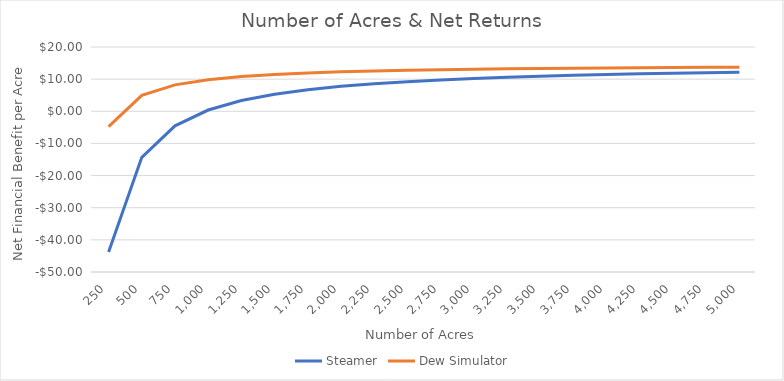
| Category | Steamer | Dew Simulator |
|---|---|---|
| 250.0 | -43.779 | -4.768 |
| 500.0 | -14.332 | 4.971 |
| 750.0 | -4.517 | 8.218 |
| 1000.0 | 0.391 | 9.841 |
| 1250.0 | 3.336 | 10.815 |
| 1500.0 | 5.299 | 11.464 |
| 1750.0 | 6.701 | 11.928 |
| 2000.0 | 7.753 | 12.276 |
| 2250.0 | 8.571 | 12.546 |
| 2500.0 | 9.225 | 12.763 |
| 2750.0 | 9.761 | 12.94 |
| 3000.0 | 10.207 | 13.087 |
| 3250.0 | 10.584 | 13.212 |
| 3500.0 | 10.908 | 13.319 |
| 3750.0 | 11.188 | 13.412 |
| 4000.0 | 11.434 | 13.493 |
| 4250.0 | 11.65 | 13.565 |
| 4500.0 | 11.843 | 13.628 |
| 4750.0 | 12.015 | 13.685 |
| 5000.0 | 12.17 | 13.736 |